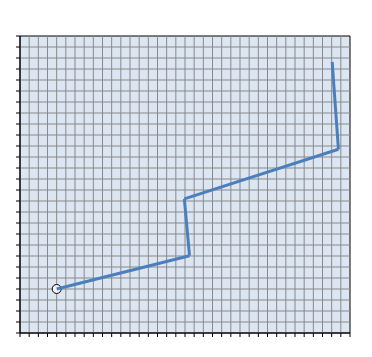
| Category | Series 0 |
|---|---|
| 100000000.0 | 100000000 |
| 100000072.45026481 | 100000015.127 |
| 100000069.64719972 | 100000040.944 |
| 100000153.69028756 | 100000063.506 |
| 100000150.277 | 100000103.277 |
| 100000150.277 | 100000103.277 |
| 100000150.277 | 100000103.277 |
| 100000150.277 | 100000103.277 |
| 100000150.277 | 100000103.277 |
| 100000150.277 | 100000103.277 |
| 100000150.277 | 100000103.277 |
| 100000150.277 | 100000103.277 |
| 100000150.277 | 100000103.277 |
| 100000150.277 | 100000103.277 |
| 100000150.277 | 100000103.277 |
| 100000150.277 | 100000103.277 |
| 100000150.277 | 100000103.277 |
| 100000150.277 | 100000103.277 |
| 100000150.277 | 100000103.277 |
| 100000150.277 | 100000103.277 |
| 100000150.277 | 100000103.277 |
| 100000150.277 | 100000103.277 |
| 100000150.277 | 100000103.277 |
| 100000150.277 | 100000103.277 |
| 100000150.277 | 100000103.277 |
| 100000150.277 | 100000103.277 |
| 100000150.277 | 100000103.277 |
| 100000150.277 | 100000103.277 |
| 100000150.277 | 100000103.277 |
| 100000150.277 | 100000103.277 |
| 100000150.277 | 100000103.277 |
| 100000150.277 | 100000103.277 |
| 100000150.277 | 100000103.277 |
| 100000150.277 | 100000103.277 |
| 100000150.277 | 100000103.277 |
| 100000150.277 | 100000103.277 |
| 100000150.277 | 100000103.277 |
| 100000150.277 | 100000103.277 |
| 100000150.277 | 100000103.277 |
| 100000150.277 | 100000103.277 |
| 100000150.277 | 100000103.277 |
| 100000150.277 | 100000103.277 |
| 100000150.277 | 100000103.277 |
| 100000150.277 | 100000103.277 |
| 100000150.277 | 100000103.277 |
| 100000150.277 | 100000103.277 |
| 100000150.277 | 100000103.277 |
| 100000150.277 | 100000103.277 |
| 100000150.277 | 100000103.277 |
| 100000150.277 | 100000103.277 |
| 100000150.277 | 100000103.277 |
| 100000150.277 | 100000103.277 |
| 100000150.277 | 100000103.277 |
| 100000150.277 | 100000103.277 |
| 100000150.277 | 100000103.277 |
| 100000150.277 | 100000103.277 |
| 100000150.277 | 100000103.277 |
| 100000150.277 | 100000103.277 |
| 100000150.277 | 100000103.277 |
| 100000150.277 | 100000103.277 |
| 100000150.277 | 100000103.277 |
| 100000150.277 | 100000103.277 |
| 100000150.277 | 100000103.277 |
| 100000150.277 | 100000103.277 |
| 100000150.277 | 100000103.277 |
| 100000150.277 | 100000103.277 |
| 100000150.277 | 100000103.277 |
| 100000150.277 | 100000103.277 |
| 100000150.277 | 100000103.277 |
| 100000150.277 | 100000103.277 |
| 100000150.277 | 100000103.277 |
| 100000150.277 | 100000103.277 |
| 100000150.277 | 100000103.277 |
| 100000150.277 | 100000103.277 |
| 100000150.277 | 100000103.277 |
| 100000150.277 | 100000103.277 |
| 100000150.277 | 100000103.277 |
| 100000150.277 | 100000103.277 |
| 100000150.277 | 100000103.277 |
| 100000150.277 | 100000103.277 |
| 100000150.277 | 100000103.277 |
| 100000150.277 | 100000103.277 |
| 100000150.277 | 100000103.277 |
| 100000150.277 | 100000103.277 |
| 100000150.277 | 100000103.277 |
| 100000150.277 | 100000103.277 |
| 100000150.277 | 100000103.277 |
| 100000150.277 | 100000103.277 |
| 100000150.277 | 100000103.277 |
| 100000150.277 | 100000103.277 |
| 100000150.277 | 100000103.277 |
| 100000150.277 | 100000103.277 |
| 100000150.277 | 100000103.277 |
| 100000150.277 | 100000103.277 |
| 100000150.277 | 100000103.277 |
| 100000150.277 | 100000103.277 |
| 100000150.277 | 100000103.277 |
| 100000150.277 | 100000103.277 |
| 100000150.277 | 100000103.277 |
| 100000150.277 | 100000103.277 |
| 100000150.277 | 100000103.277 |